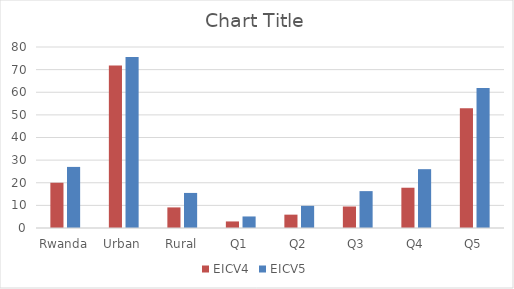
| Category | EICV4 | EICV5 |
|---|---|---|
| Rwanda | 20 | 27 |
| Urban | 71.8 | 75.6 |
| Rural | 9.1 | 15.5 |
| Q1 | 2.9 | 5.1 |
| Q2 | 5.9 | 9.8 |
| Q3 | 9.5 | 16.3 |
| Q4 | 17.8 | 26 |
| Q5 | 52.9 | 61.9 |